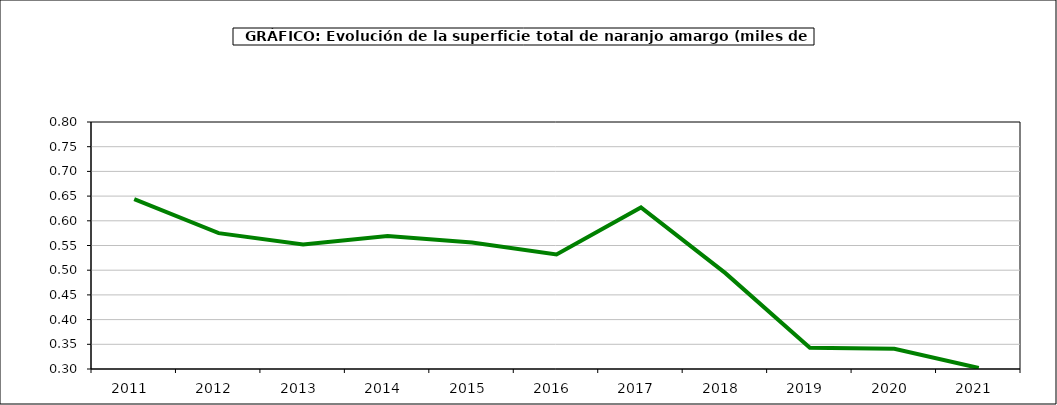
| Category | superficie |
|---|---|
| 2011.0 | 0.644 |
| 2012.0 | 0.575 |
| 2013.0 | 0.552 |
| 2014.0 | 0.569 |
| 2015.0 | 0.556 |
| 2016.0 | 0.532 |
| 2017.0 | 0.627 |
| 2018.0 | 0.494 |
| 2019.0 | 0.343 |
| 2020.0 | 0.341 |
| 2021.0 | 0.302 |